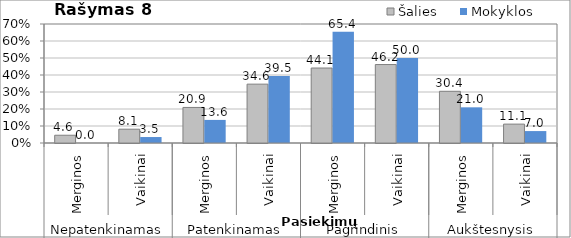
| Category | Šalies | Mokyklos |
|---|---|---|
| 0 | 4.563 | 0 |
| 1 | 8.12 | 3.509 |
| 2 | 20.913 | 13.58 |
| 3 | 34.615 | 39.474 |
| 4 | 44.106 | 65.432 |
| 5 | 46.154 | 50 |
| 6 | 30.418 | 20.988 |
| 7 | 11.111 | 7.018 |